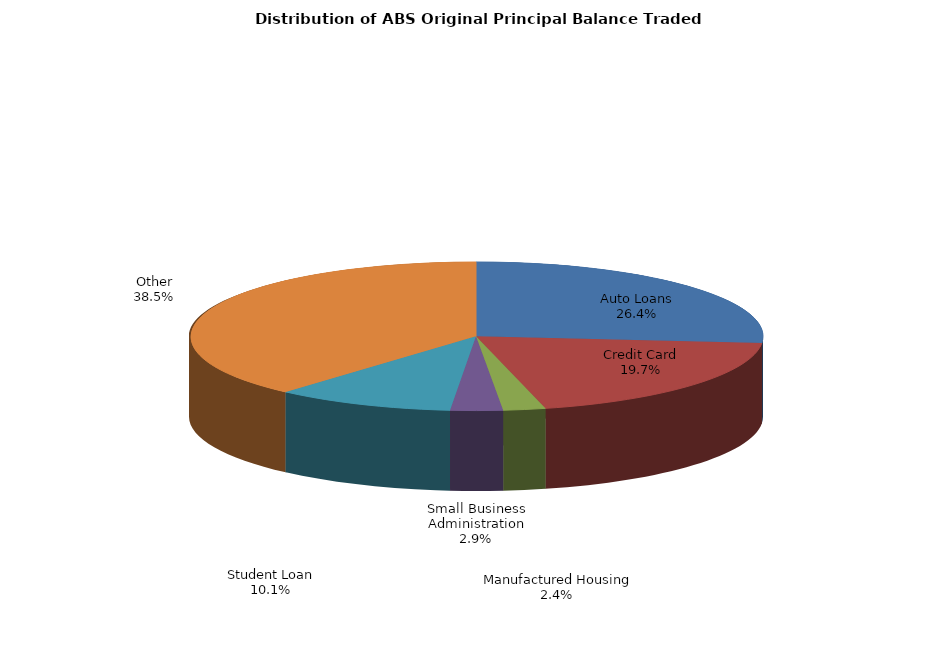
| Category | Series 0 |
|---|---|
| Auto Loans | 551593306.979 |
| Credit Card | 410275933.79 |
| Manufactured Housing | 49666437.345 |
| Small Business Administration | 61450639.159 |
| Student Loan | 210546087.155 |
| Other | 802357395.546 |